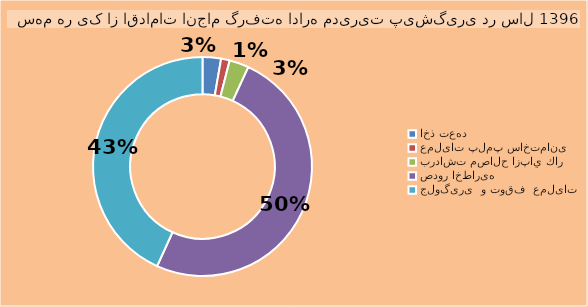
| Category | Series 0 |
|---|---|
| اخذ تعهد | 159 |
| عملیات پلمپ ساختمانی | 74 |
| برداشت مصالح ازپاي كار | 168 |
| صدور اخطاریه | 2911 |
| جلوگیری  و توقف  عملیات | 2518 |